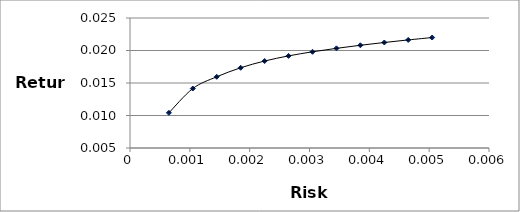
| Category | Series 0 |
|---|---|
| 0.00065 | 0.01 |
| 0.00105 | 0.014 |
| 0.00145 | 0.016 |
| 0.0018499999999999999 | 0.017 |
| 0.00225 | 0.018 |
| 0.0026499999999999996 | 0.019 |
| 0.0030499999999999998 | 0.02 |
| 0.00345 | 0.02 |
| 0.00385 | 0.021 |
| 0.00425 | 0.021 |
| 0.0046500000000000005 | 0.022 |
| 0.005050000000000001 | 0.022 |